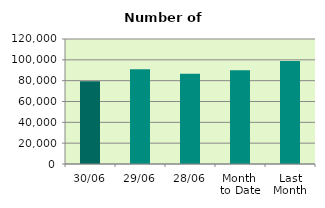
| Category | Series 0 |
|---|---|
| 30/06 | 79408 |
| 29/06 | 90854 |
| 28/06 | 86582 |
| Month 
to Date | 89884.909 |
| Last
Month | 98885.545 |